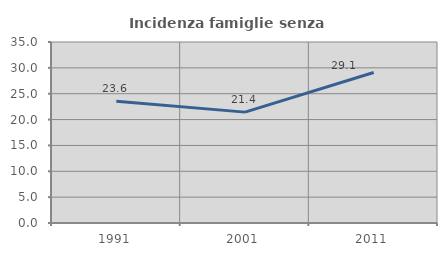
| Category | Incidenza famiglie senza nuclei |
|---|---|
| 1991.0 | 23.55 |
| 2001.0 | 21.44 |
| 2011.0 | 29.098 |